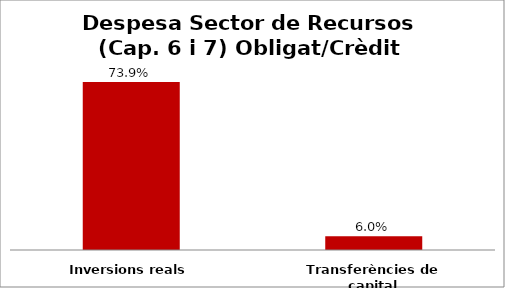
| Category | Series 0 |
|---|---|
| Inversions reals | 0.739 |
| Transferències de capital | 0.06 |